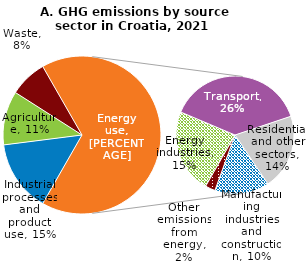
| Category | Series 0 |
|---|---|
| Industrial processes and product use | 14.709 |
| Agriculture | 11.048 |
| Waste | 7.679 |
| Energy industries | 15.367 |
| Transport | 25.615 |
| Residential and other sectors | 13.803 |
| Manufacturing industries and construction | 9.942 |
| Other emissions from energy | 1.836 |